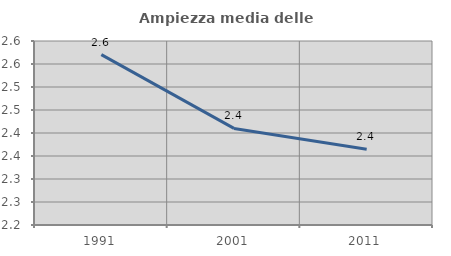
| Category | Ampiezza media delle famiglie |
|---|---|
| 1991.0 | 2.57 |
| 2001.0 | 2.41 |
| 2011.0 | 2.365 |